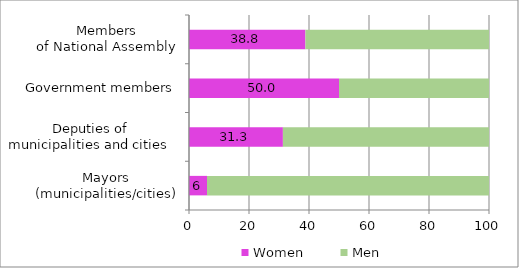
| Category | Women | Men |
|---|---|---|
| Mayors
(municipalities/cities) | 6 | 94 |
| Deputies of
municipalities and cities 
 | 31.3 | 68.7 |
| Government members | 50 | 50 |
| Members
of National Assembly | 38.8 | 61.2 |